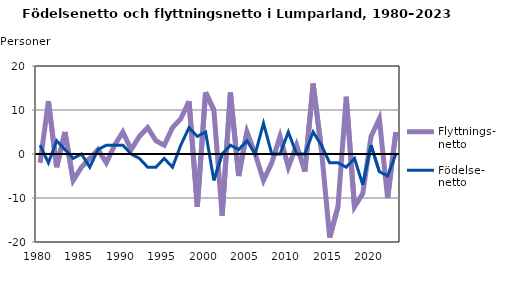
| Category | Flyttnings- netto | Födelse- netto |
|---|---|---|
| 1980.0 | -2 | 2 |
| 1981.0 | 12 | -2 |
| 1982.0 | -3 | 3 |
| 1983.0 | 5 | 1 |
| 1984.0 | -6 | -1 |
| 1985.0 | -3 | 0 |
| 1986.0 | -1 | -3 |
| 1987.0 | 1 | 1 |
| 1988.0 | -2 | 2 |
| 1989.0 | 2 | 2 |
| 1990.0 | 5 | 2 |
| 1991.0 | 1 | 0 |
| 1992.0 | 4 | -1 |
| 1993.0 | 6 | -3 |
| 1994.0 | 3 | -3 |
| 1995.0 | 2 | -1 |
| 1996.0 | 6 | -3 |
| 1997.0 | 8 | 2 |
| 1998.0 | 12 | 6 |
| 1999.0 | -12 | 4 |
| 2000.0 | 14 | 5 |
| 2001.0 | 10 | -6 |
| 2002.0 | -14 | 0 |
| 2003.0 | 14 | 2 |
| 2004.0 | -5 | 1 |
| 2005.0 | 5 | 3 |
| 2006.0 | 0 | 0 |
| 2007.0 | -6 | 7 |
| 2008.0 | -2 | 0 |
| 2009.0 | 4 | 0 |
| 2010.0 | -3 | 5 |
| 2011.0 | 2 | 0 |
| 2012.0 | -4 | 0 |
| 2013.0 | 16 | 5 |
| 2014.0 | 1 | 2 |
| 2015.0 | -19 | -2 |
| 2016.0 | -12 | -2 |
| 2017.0 | 13 | -3 |
| 2018.0 | -12 | -1 |
| 2019.0 | -9 | -7 |
| 2020.0 | 4 | 2 |
| 2021.0 | 8 | -4 |
| 2022.0 | -10 | -5 |
| 2023.0 | 5 | 0 |